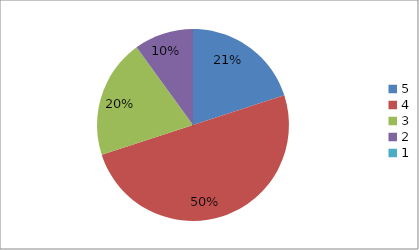
| Category | Series 0 | Series 1 |
|---|---|---|
| 5.0 | 20 | 20 |
| 4.0 | 50 | 50 |
| 3.0 | 20 | 20 |
| 2.0 | 10 | 10 |
| 1.0 | 0 | 0 |